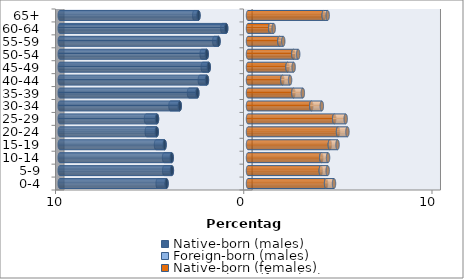
| Category | Native-born (males) | Foreign-born (males) | Native-born (females) | Foreign-born (females) |
|---|---|---|---|---|
| 0-4 | -4.328 | -0.47 | 4.147 | 0.422 |
| 5-9 | -4.044 | -0.41 | 3.867 | 0.366 |
| 10-14 | -4.053 | -0.405 | 3.893 | 0.36 |
| 15-19 | -4.432 | -0.455 | 4.348 | 0.409 |
| 20-24 | -4.848 | -0.53 | 4.783 | 0.5 |
| 25-29 | -4.834 | -0.585 | 4.581 | 0.609 |
| 30-34 | -3.626 | -0.494 | 3.363 | 0.559 |
| 35-39 | -2.693 | -0.441 | 2.411 | 0.503 |
| 40-44 | -2.182 | -0.376 | 1.825 | 0.41 |
| 45-49 | -2.085 | -0.319 | 2.097 | 0.327 |
| 50-54 | -2.193 | -0.269 | 2.408 | 0.259 |
| 55-59 | -1.567 | -0.225 | 1.667 | 0.206 |
| 60-64 | -1.16 | -0.205 | 1.179 | 0.185 |
| 65+ | -2.632 | -0.225 | 4.022 | 0.212 |